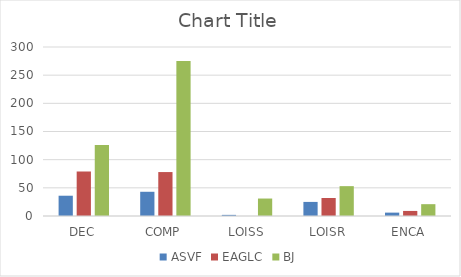
| Category | ASVF | EAGLC | BJ |
|---|---|---|---|
| DEC | 36 | 79 | 126 |
| COMP | 43 | 78 | 275 |
| LOISS | 2 | 0 | 31 |
| LOISR | 25 | 32 | 53 |
| ENCA | 6 | 9 | 21 |